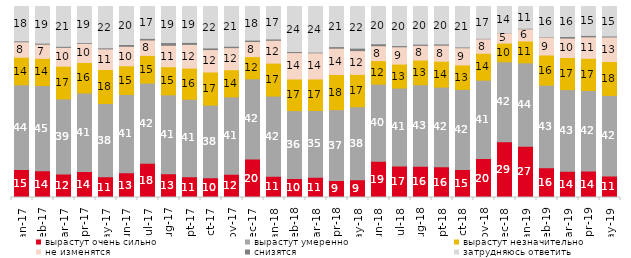
| Category | вырастут очень сильно | вырастут умеренно | вырастут незначительно | не изменятся | снизятся | затрудняюсь ответить |
|---|---|---|---|---|---|---|
| 2017-01-01 | 14.65 | 44.35 | 14.45 | 8.05 | 0.5 | 18 |
| 2017-02-01 | 13.95 | 44.7 | 14.2 | 7.4 | 0.55 | 19.2 |
| 2017-03-01 | 12.25 | 39.35 | 17.15 | 9.85 | 0.55 | 20.85 |
| 2017-04-01 | 13.55 | 41.15 | 16 | 9.95 | 0.4 | 18.95 |
| 2017-05-01 | 10.9 | 38.3 | 17.8 | 10.8 | 0.55 | 21.65 |
| 2017-06-01 | 13 | 40.95 | 15 | 10.2 | 0.95 | 19.9 |
| 2017-07-01 | 17.95 | 41.95 | 14.5 | 8.05 | 0.85 | 16.7 |
| 2017-08-01 | 12.5 | 41.25 | 14.7 | 11.25 | 1.4 | 18.9 |
| 2017-09-01 | 10.9 | 40.55 | 16.3 | 12.4 | 1.05 | 18.8 |
| 2017-10-01 | 10.4 | 37.95 | 17.35 | 11.75 | 0.85 | 21.7 |
| 2017-11-01 | 12.2 | 40.5 | 14.2 | 11.55 | 0.75 | 20.8 |
| 2017-12-01 | 20.1 | 42.05 | 11.6 | 7.9 | 0.75 | 17.6 |
| 2018-01-01 | 11.1 | 42 | 17.25 | 11.95 | 0.7 | 17 |
| 2018-02-01 | 10 | 35.5 | 16.55 | 13.8 | 0.55 | 23.6 |
| 2018-03-01 | 10.65 | 34.9 | 16.5 | 13.7 | 0.35 | 23.9 |
| 2018-04-01 | 8.95 | 37.05 | 18.4 | 13.75 | 0.85 | 21 |
| 2018-05-01 | 9.3 | 38.2 | 16.95 | 12.45 | 1.3 | 21.8 |
| 2018-06-01 | 18.95 | 40.4 | 12.3 | 7.8 | 1.05 | 19.5 |
| 2018-07-01 | 16.55 | 40.75 | 12.55 | 9.05 | 0.65 | 20.45 |
| 2018-08-01 | 16.35 | 42.7 | 12.9 | 7.7 | 0.65 | 19.7 |
| 2018-09-01 | 16.05 | 41.75 | 13.55 | 8.4 | 0.65 | 19.6 |
| 2018-10-01 | 14.6 | 42 | 12.8 | 9 | 0.4 | 21.2 |
| 2018-11-01 | 20.359 | 41.068 | 14.072 | 7.585 | 0.25 | 16.667 |
| 2018-12-01 | 29.25 | 41.8 | 9.8 | 5.4 | 0.1 | 13.65 |
| 2019-01-01 | 26.85 | 43.65 | 11.45 | 6.35 | 0.3 | 11.4 |
| 2019-02-01 | 15.6 | 43.2 | 15.8 | 9.35 | 0.15 | 15.9 |
| 2019-03-01 | 13.774 | 42.715 | 16.808 | 10.144 | 0.845 | 15.714 |
| 2019-04-01 | 13.911 | 42.129 | 16.832 | 11.238 | 0.743 | 15.149 |
| 2019-05-01 | 11.293 | 42.15 | 17.732 | 12.878 | 0.495 | 15.453 |